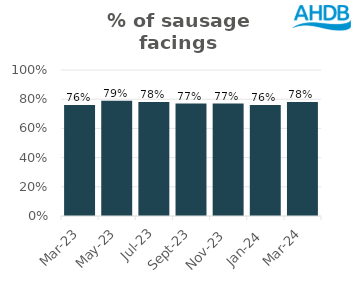
| Category | Sausage |
|---|---|
| 2023-03-01 | 0.76 |
| 2023-05-01 | 0.79 |
| 2023-07-01 | 0.78 |
| 2023-09-01 | 0.77 |
| 2023-11-01 | 0.77 |
| 2024-01-01 | 0.76 |
| 2024-03-01 | 0.78 |